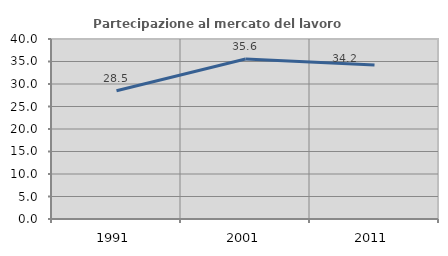
| Category | Partecipazione al mercato del lavoro  femminile |
|---|---|
| 1991.0 | 28.488 |
| 2001.0 | 35.569 |
| 2011.0 | 34.195 |